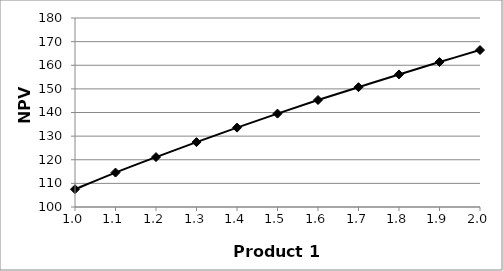
| Category | Series 0 |
|---|---|
| 1.0 | 107.518 |
| 1.1 | 114.571 |
| 1.2 | 121.129 |
| 1.3 | 127.469 |
| 1.4 | 133.601 |
| 1.5 | 139.537 |
| 1.6 | 145.286 |
| 1.7 | 150.717 |
| 1.8 | 156.116 |
| 1.9 | 161.354 |
| 2.0 | 166.438 |